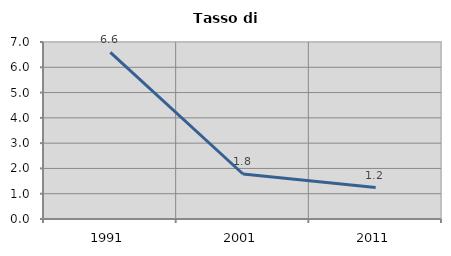
| Category | Tasso di disoccupazione   |
|---|---|
| 1991.0 | 6.588 |
| 2001.0 | 1.779 |
| 2011.0 | 1.244 |